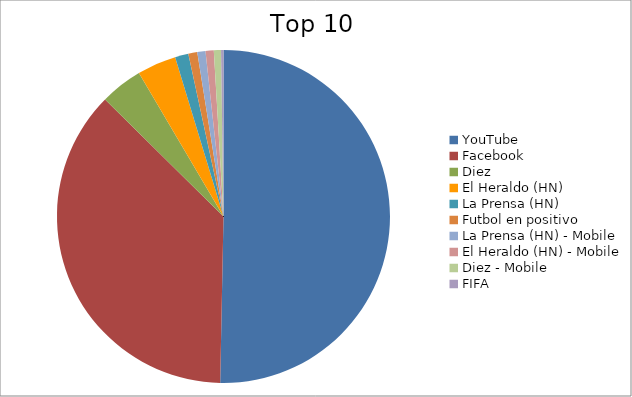
| Category | Series 0 |
|---|---|
| YouTube | 49.25 |
| Facebook | 36.3 |
| Diez | 4.03 |
| El Heraldo (HN) | 3.71 |
| La Prensa (HN) | 1.27 |
| Futbol en positivo | 0.85 |
| La Prensa (HN) - Mobile | 0.78 |
| El Heraldo (HN) - Mobile | 0.78 |
| Diez - Mobile | 0.68 |
| FIFA | 0.23 |